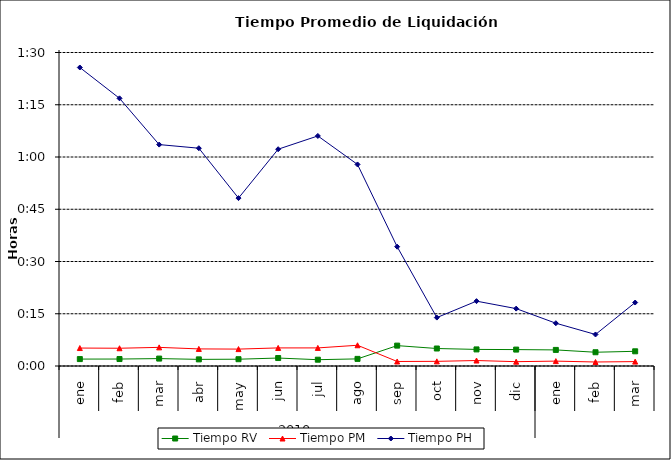
| Category | Tiempo RV | Tiempo PM | Tiempo PH |
|---|---|---|---|
| 0 | 0.001 | 0.004 | 0.06 |
| 1 | 0.001 | 0.004 | 0.053 |
| 2 | 0.001 | 0.004 | 0.044 |
| 3 | 0.001 | 0.003 | 0.043 |
| 4 | 0.001 | 0.003 | 0.033 |
| 5 | 0.002 | 0.004 | 0.043 |
| 6 | 0.001 | 0.004 | 0.046 |
| 7 | 0.001 | 0.004 | 0.04 |
| 8 | 0.004 | 0.001 | 0.024 |
| 9 | 0.003 | 0.001 | 0.01 |
| 10 | 0.003 | 0.001 | 0.013 |
| 11 | 0.003 | 0.001 | 0.011 |
| 12 | 0.003 | 0.001 | 0.009 |
| 13 | 0.003 | 0.001 | 0.006 |
| 14 | 0.003 | 0.001 | 0.013 |